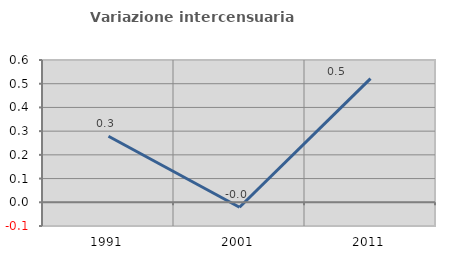
| Category | Variazione intercensuaria annua |
|---|---|
| 1991.0 | 0.279 |
| 2001.0 | -0.021 |
| 2011.0 | 0.521 |